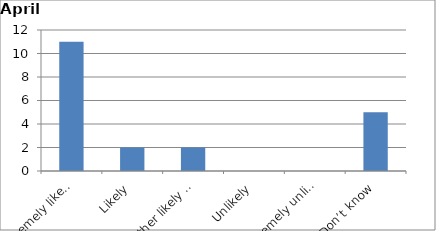
| Category | Series 0 |
|---|---|
| Extremely likely | 11 |
| Likely | 2 |
| Neither likely nor unlikely | 2 |
| Unlikely | 0 |
| Extremely unlikely | 0 |
| Don’t know | 5 |